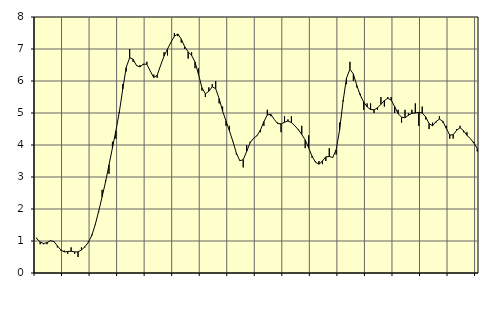
| Category | Piggar | Series 1 |
|---|---|---|
| nan | 1.1 | 1.07 |
| 87.0 | 0.9 | 0.97 |
| 87.0 | 0.9 | 0.92 |
| 87.0 | 0.9 | 0.95 |
| nan | 1 | 1.01 |
| 88.0 | 1 | 0.98 |
| 88.0 | 0.8 | 0.85 |
| 88.0 | 0.7 | 0.72 |
| nan | 0.7 | 0.66 |
| 89.0 | 0.6 | 0.67 |
| 89.0 | 0.8 | 0.68 |
| 89.0 | 0.6 | 0.66 |
| nan | 0.5 | 0.66 |
| 90.0 | 0.8 | 0.72 |
| 90.0 | 0.8 | 0.82 |
| 90.0 | 1 | 0.96 |
| nan | 1.2 | 1.17 |
| 91.0 | 1.5 | 1.51 |
| 91.0 | 1.9 | 1.93 |
| 91.0 | 2.6 | 2.38 |
| nan | 2.9 | 2.85 |
| 92.0 | 3.1 | 3.38 |
| 92.0 | 4.1 | 3.91 |
| 92.0 | 4.2 | 4.44 |
| nan | 5 | 5.03 |
| 93.0 | 5.9 | 5.75 |
| 93.0 | 6.3 | 6.42 |
| 93.0 | 7 | 6.73 |
| nan | 6.6 | 6.68 |
| 94.0 | 6.5 | 6.48 |
| 94.0 | 6.5 | 6.44 |
| 94.0 | 6.5 | 6.53 |
| nan | 6.6 | 6.52 |
| 95.0 | 6.3 | 6.31 |
| 95.0 | 6.2 | 6.11 |
| 95.0 | 6.1 | 6.18 |
| nan | 6.5 | 6.49 |
| 96.0 | 6.9 | 6.78 |
| 96.0 | 6.8 | 7 |
| 96.0 | 7.2 | 7.21 |
| nan | 7.5 | 7.4 |
| 97.0 | 7.4 | 7.47 |
| 97.0 | 7.2 | 7.31 |
| 97.0 | 7 | 7.07 |
| nan | 6.7 | 6.91 |
| 98.0 | 6.9 | 6.8 |
| 98.0 | 6.4 | 6.59 |
| 98.0 | 6.4 | 6.21 |
| nan | 5.7 | 5.79 |
| 99.0 | 5.5 | 5.6 |
| 99.0 | 5.8 | 5.68 |
| 99.0 | 5.9 | 5.82 |
| nan | 6 | 5.76 |
| 0.0 | 5.3 | 5.45 |
| 0.0 | 5.2 | 5.06 |
| 0.0 | 4.6 | 4.75 |
| nan | 4.6 | 4.44 |
| 1.0 | 4.1 | 4.11 |
| 1.0 | 3.7 | 3.75 |
| 1.0 | 3.5 | 3.51 |
| nan | 3.3 | 3.54 |
| 2.0 | 4 | 3.8 |
| 2.0 | 4.1 | 4.07 |
| 2.0 | 4.2 | 4.21 |
| nan | 4.3 | 4.29 |
| 3.0 | 4.4 | 4.47 |
| 3.0 | 4.6 | 4.73 |
| 3.0 | 5.1 | 4.94 |
| nan | 4.9 | 4.96 |
| 4.0 | 4.8 | 4.8 |
| 4.0 | 4.7 | 4.67 |
| 4.0 | 4.4 | 4.66 |
| nan | 4.9 | 4.71 |
| 5.0 | 4.8 | 4.75 |
| 5.0 | 4.9 | 4.7 |
| 5.0 | 4.6 | 4.6 |
| nan | 4.5 | 4.48 |
| 6.0 | 4.6 | 4.33 |
| 6.0 | 3.9 | 4.16 |
| 6.0 | 4.3 | 3.91 |
| nan | 3.6 | 3.65 |
| 7.0 | 3.5 | 3.46 |
| 7.0 | 3.5 | 3.4 |
| 7.0 | 3.4 | 3.5 |
| nan | 3.5 | 3.63 |
| 8.0 | 3.9 | 3.64 |
| 8.0 | 3.6 | 3.61 |
| 8.0 | 3.7 | 3.85 |
| nan | 4.7 | 4.47 |
| 9.0 | 5.4 | 5.36 |
| 9.0 | 5.9 | 6.09 |
| 9.0 | 6.6 | 6.37 |
| nan | 6 | 6.22 |
| 10.0 | 5.8 | 5.86 |
| 10.0 | 5.6 | 5.56 |
| 10.0 | 5.1 | 5.34 |
| nan | 5.3 | 5.19 |
| 11.0 | 5.3 | 5.11 |
| 11.0 | 5 | 5.1 |
| 11.0 | 5.1 | 5.16 |
| nan | 5.5 | 5.27 |
| 12.0 | 5.2 | 5.39 |
| 12.0 | 5.5 | 5.46 |
| 12.0 | 5.5 | 5.4 |
| nan | 5 | 5.2 |
| 13.0 | 5.1 | 4.98 |
| 13.0 | 4.7 | 4.87 |
| 13.0 | 5.1 | 4.85 |
| nan | 5 | 4.93 |
| 14.0 | 5.1 | 4.99 |
| 14.0 | 5.3 | 5 |
| 14.0 | 4.6 | 5.02 |
| nan | 5.2 | 5 |
| 15.0 | 4.8 | 4.88 |
| 15.0 | 4.5 | 4.67 |
| 15.0 | 4.7 | 4.6 |
| nan | 4.7 | 4.73 |
| 16.0 | 4.9 | 4.81 |
| 16.0 | 4.7 | 4.74 |
| 16.0 | 4.6 | 4.52 |
| nan | 4.2 | 4.31 |
| 17.0 | 4.2 | 4.32 |
| 17.0 | 4.5 | 4.46 |
| 17.0 | 4.6 | 4.54 |
| nan | 4.4 | 4.45 |
| 18.0 | 4.4 | 4.3 |
| 18.0 | 4.2 | 4.2 |
| 18.0 | 4.1 | 4.06 |
| nan | 3.8 | 3.89 |